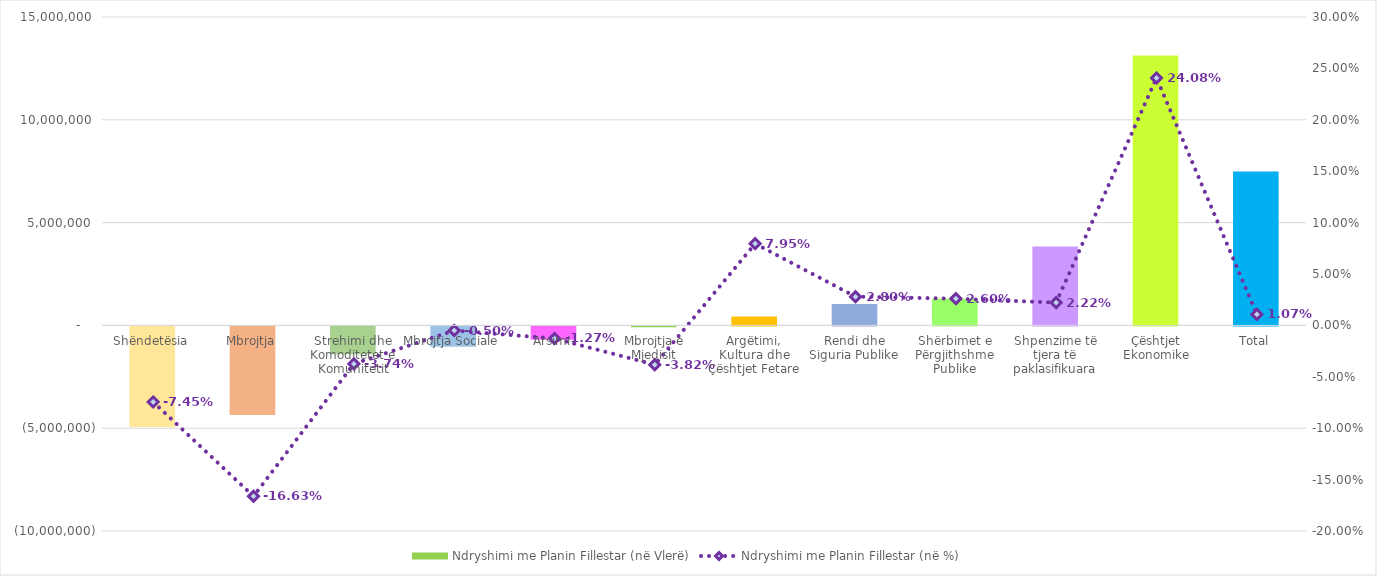
| Category | Ndryshimi me Planin Fillestar (në Vlerë) |
|---|---|
| Shëndetësia | -4894958 |
| Mbrojtja | -4309605 |
| Strehimi dhe Komoditetet e Komunitetit | -1353863 |
| Mbrojtja Sociale | -986800 |
| Arsimi | -648959 |
| Mbrojtja e Mjedisit | -46000 |
| Argëtimi, Kultura dhe Çështjet Fetare | 431940 |
| Rendi dhe Siguria Publike | 1037176 |
| Shërbimet e Përgjithshme Publike | 1300671 |
| Shpenzime të tjera të paklasifikuara | 3836000 |
| Çështjet Ekonomike | 13124530 |
| Total | 7490132 |